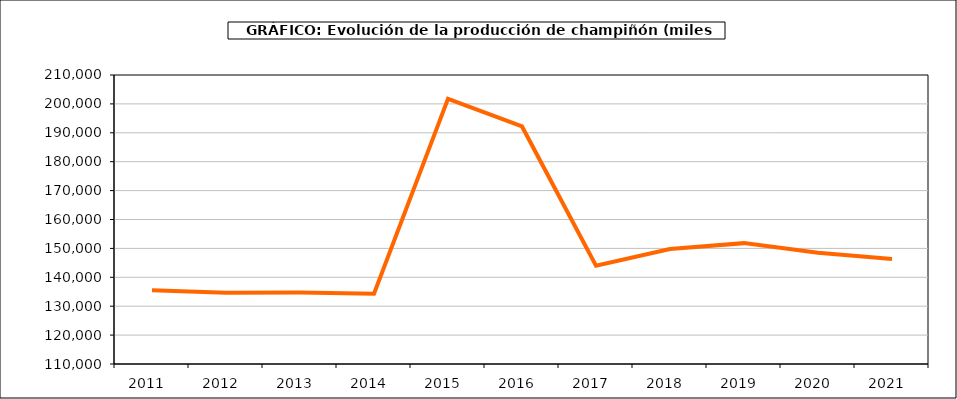
| Category | producción |
|---|---|
| 2011.0 | 135545 |
| 2012.0 | 134676 |
| 2013.0 | 134768 |
| 2014.0 | 134317 |
| 2015.0 | 201740 |
| 2016.0 | 192191 |
| 2017.0 | 144052 |
| 2018.0 | 149800 |
| 2019.0 | 151823 |
| 2020.0 | 148495 |
| 2021.0 | 146349 |